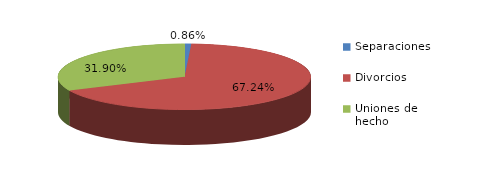
| Category | Series 0 |
|---|---|
| Separaciones | 2 |
| Divorcios | 156 |
| Uniones de hecho | 74 |